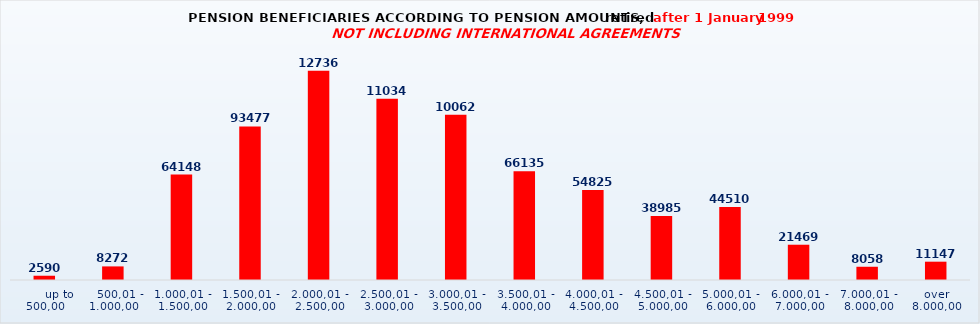
| Category | Series 0 |
|---|---|
|       up to 500,00 | 2590 |
|    500,01 - 1.000,00 | 8272 |
| 1.000,01 - 1.500,00 | 64148 |
| 1.500,01 - 2.000,00 | 93477 |
| 2.000,01 - 2.500,00 | 127361 |
| 2.500,01 - 3.000,00 | 110347 |
| 3.000,01 - 3.500,00 | 100628 |
| 3.500,01 - 4.000,00 | 66135 |
| 4.000,01 - 4.500,00 | 54825 |
| 4.500,01 - 5.000,00 | 38985 |
| 5.000,01 - 6.000,00 | 44510 |
| 6.000,01 - 7.000,00 | 21469 |
| 7.000,01 - 8.000,00 | 8058 |
| over 8.000,00 | 11147 |